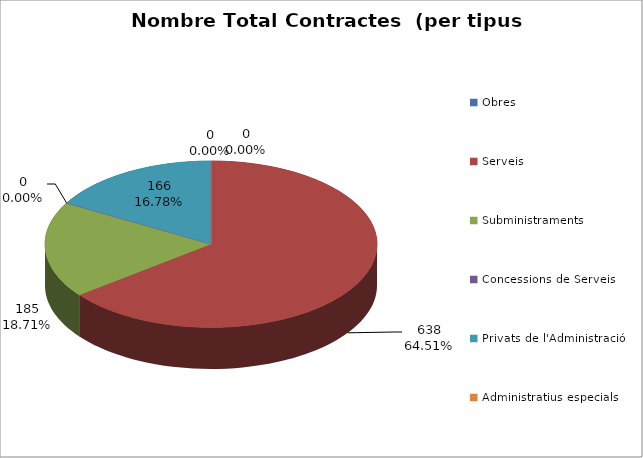
| Category | Nombre Total Contractes |
|---|---|
| Obres | 0 |
| Serveis | 638 |
| Subministraments | 185 |
| Concessions de Serveis | 0 |
| Privats de l'Administració | 166 |
| Administratius especials | 0 |